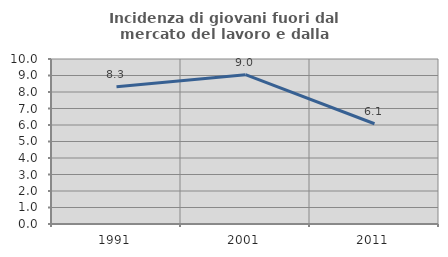
| Category | Incidenza di giovani fuori dal mercato del lavoro e dalla formazione  |
|---|---|
| 1991.0 | 8.318 |
| 2001.0 | 9.05 |
| 2011.0 | 6.077 |